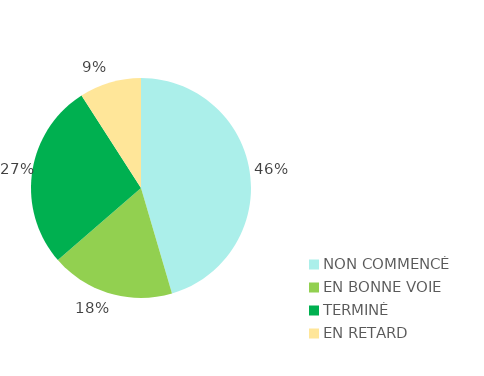
| Category | Series 0 |
|---|---|
| NON COMMENCÉ | 5 |
| EN BONNE VOIE | 2 |
| TERMINÉ | 3 |
| EN RETARD | 1 |